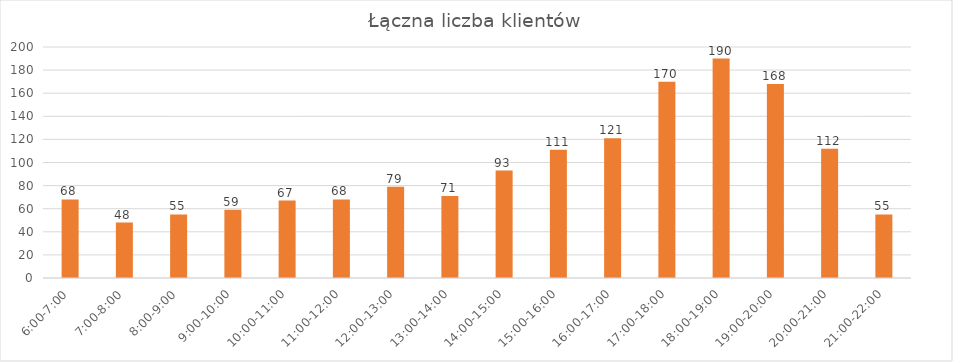
| Category | Wchodzący |
|---|---|
| 6:00-7:00 | 68 |
| 7:00-8:00 | 48 |
| 8:00-9:00 | 55 |
| 9:00-10:00 | 59 |
| 10:00-11:00 | 67 |
| 11:00-12:00 | 68 |
| 12:00-13:00 | 79 |
| 13:00-14:00 | 71 |
| 14:00-15:00 | 93 |
| 15:00-16:00 | 111 |
| 16:00-17:00 | 121 |
| 17:00-18:00 | 170 |
| 18:00-19:00 | 190 |
| 19:00-20:00 | 168 |
| 20:00-21:00 | 112 |
| 21:00-22:00 | 55 |